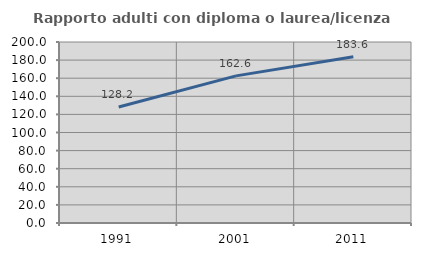
| Category | Rapporto adulti con diploma o laurea/licenza media  |
|---|---|
| 1991.0 | 128.229 |
| 2001.0 | 162.561 |
| 2011.0 | 183.624 |